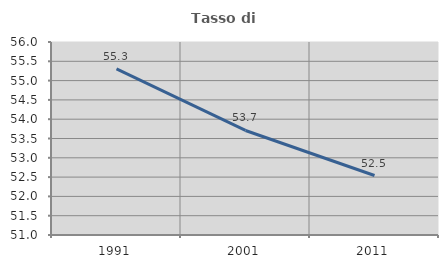
| Category | Tasso di occupazione   |
|---|---|
| 1991.0 | 55.301 |
| 2001.0 | 53.708 |
| 2011.0 | 52.541 |